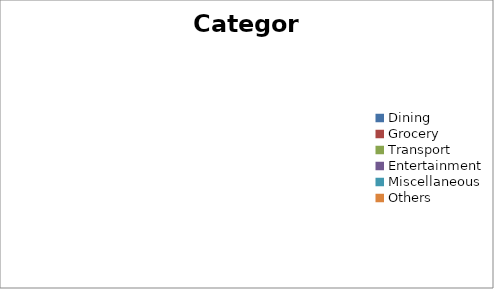
| Category | Series 0 |
|---|---|
| Dining | 0 |
| Grocery | 0 |
| Transport | 0 |
| Entertainment | 0 |
| Miscellaneous | 0 |
| Others | 0 |